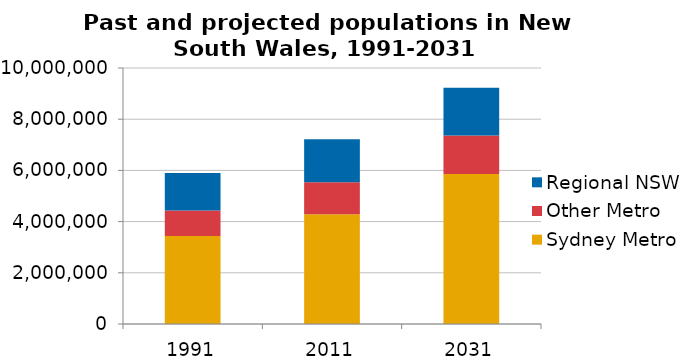
| Category | Sydney Metro | Other Metro | Regional NSW |
|---|---|---|---|
| 1991.0 | 3433050 | 1000150 | 1465550 |
| 2011.0 | 4286300 | 1249850 | 1682350 |
| 2031.0 | 5861850 | 1500900 | 1865800 |